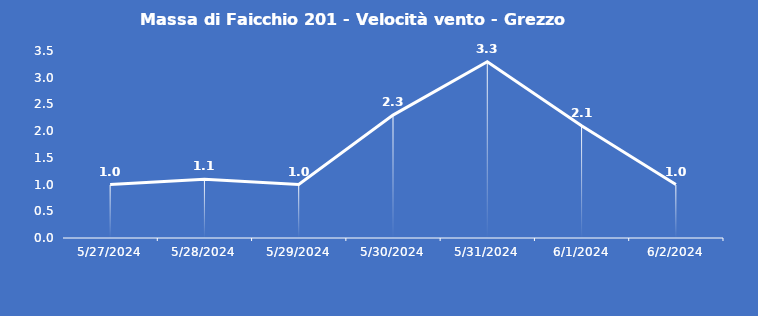
| Category | Massa di Faicchio 201 - Velocità vento - Grezzo (m/s) |
|---|---|
| 5/27/24 | 1 |
| 5/28/24 | 1.1 |
| 5/29/24 | 1 |
| 5/30/24 | 2.3 |
| 5/31/24 | 3.3 |
| 6/1/24 | 2.1 |
| 6/2/24 | 1 |